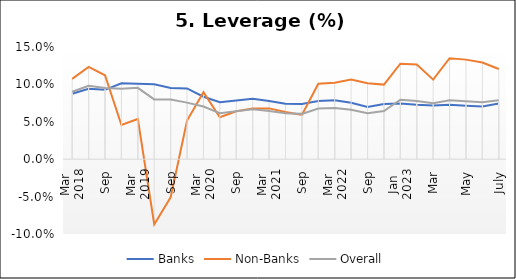
| Category | Banks | Non-Banks | Overall |
|---|---|---|---|
| 0 | 0.088 | 0.107 | 0.09 |
| 1 | 0.094 | 0.123 | 0.098 |
| 2 | 0.093 | 0.112 | 0.095 |
| 3 | 0.102 | 0.046 | 0.094 |
| 4 | 0.101 | 0.054 | 0.095 |
| 5 | 0.1 | -0.087 | 0.08 |
| 6 | 0.095 | -0.051 | 0.08 |
| 7 | 0.095 | 0.052 | 0.076 |
| 8 | 0.084 | 0.09 | 0.07 |
| 9 | 0.076 | 0.056 | 0.062 |
| 10 | 0.079 | 0.064 | 0.064 |
| 11 | 0.081 | 0.068 | 0.067 |
| 12 | 0.078 | 0.068 | 0.064 |
| 13 | 0.074 | 0.063 | 0.061 |
| 14 | 0.074 | 0.059 | 0.061 |
| 15 | 0.078 | 0.101 | 0.068 |
| 16 | 0.079 | 0.102 | 0.068 |
| 17 | 0.075 | 0.106 | 0.066 |
| 18 | 0.07 | 0.102 | 0.061 |
| 19 | 0.074 | 0.1 | 0.064 |
| 20 | 0.074 | 0.128 | 0.079 |
| 21 | 0.073 | 0.126 | 0.078 |
| 22 | 0.072 | 0.106 | 0.075 |
| 23 | 0.073 | 0.135 | 0.079 |
| 24 | 0.072 | 0.133 | 0.077 |
| 25 | 0.071 | 0.129 | 0.076 |
| 26 | 0.074 | 0.121 | 0.079 |